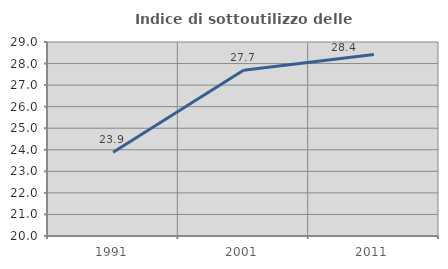
| Category | Indice di sottoutilizzo delle abitazioni  |
|---|---|
| 1991.0 | 23.885 |
| 2001.0 | 27.688 |
| 2011.0 | 28.421 |